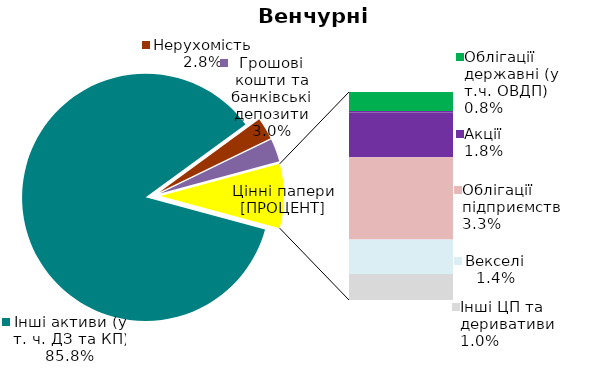
| Category | Series 0 |
|---|---|
| Інші активи (у т. ч. ДЗ та КП) | 0.858 |
| Нерухомість | 0.028 |
| Грошові кошти та банківські депозити | 0.03 |
| Банківські метали | 0 |
| Облігації державні (у т.ч. ОВДП) | 0.008 |
| Облігації місцевих позик | 0.001 |
| Акції | 0.018 |
| Облігації підприємств | 0.033 |
| Векселі | 0.014 |
| Інші ЦП та деривативи | 0.01 |